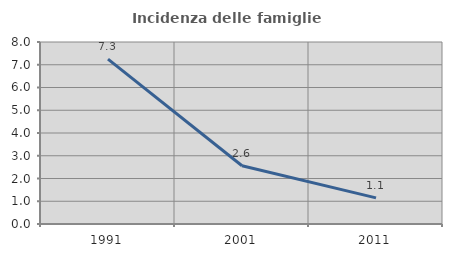
| Category | Incidenza delle famiglie numerose |
|---|---|
| 1991.0 | 7.25 |
| 2001.0 | 2.561 |
| 2011.0 | 1.148 |